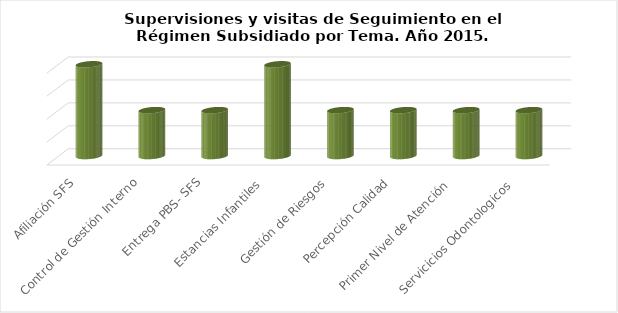
| Category | Series 0 |
|---|---|
| Afiliación SFS | 2 |
| Control de Gestión Interno | 1 |
| Entrega PBS- SFS | 1 |
| Estancias Infantiles  | 2 |
| Gestión de Riesgos | 1 |
| Percepción Calidad | 1 |
| Primer Nivel de Atención  | 1 |
| Servicicios Odontologicos  | 1 |